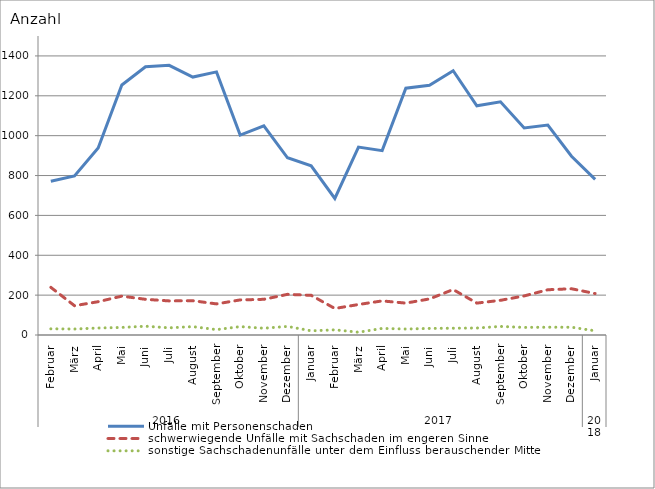
| Category | Unfälle mit Personenschaden | schwerwiegende Unfälle mit Sachschaden im engeren Sinne | sonstige Sachschadenunfälle unter dem Einfluss berauschender Mittel |
|---|---|---|---|
| 0 | 771 | 239 | 31 |
| 1 | 798 | 147 | 30 |
| 2 | 938 | 167 | 35 |
| 3 | 1254 | 195 | 38 |
| 4 | 1346 | 179 | 44 |
| 5 | 1353 | 171 | 36 |
| 6 | 1294 | 172 | 42 |
| 7 | 1320 | 156 | 27 |
| 8 | 1003 | 176 | 42 |
| 9 | 1049 | 179 | 34 |
| 10 | 889 | 204 | 43 |
| 11 | 849 | 199 | 21 |
| 12 | 685 | 133 | 26 |
| 13 | 943 | 153 | 14 |
| 14 | 925 | 171 | 33 |
| 15 | 1238 | 160 | 30 |
| 16 | 1253 | 181 | 33 |
| 17 | 1326 | 228 | 34 |
| 18 | 1150 | 160 | 35 |
| 19 | 1170 | 174 | 43 |
| 20 | 1039 | 196 | 38 |
| 21 | 1053 | 227 | 39 |
| 22 | 897 | 232 | 39 |
| 23 | 781 | 208 | 21 |